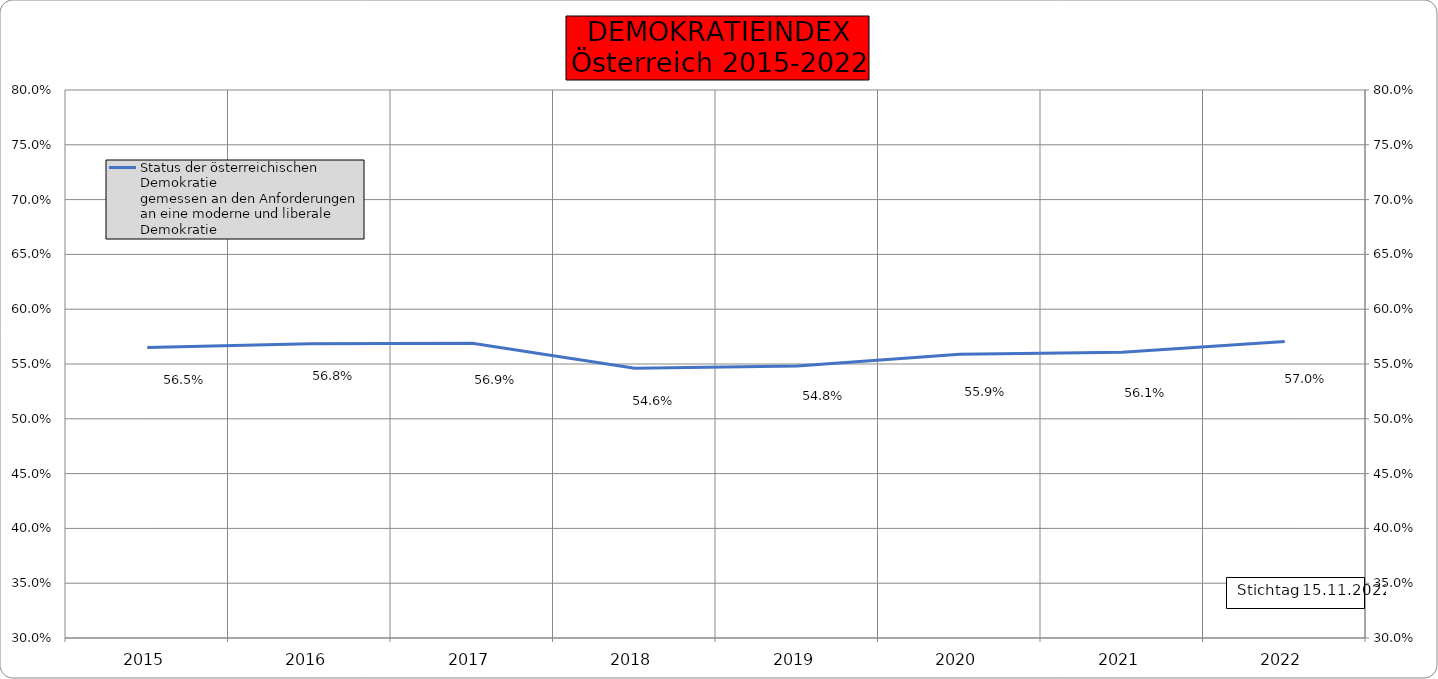
| Category | Status der österreichischen Demokratie 
gemessen an den Anforderungen an eine moderne und liberale Demokratie |
|---|---|
| 2015.0 | 0.565 |
| 2016.0 | 0.568 |
| 2017.0 | 0.569 |
| 2018.0 | 0.546 |
| 2019.0 | 0.548 |
| 2020.0 | 0.559 |
| 2021.0 | 0.561 |
| 2022.0 | 0.57 |